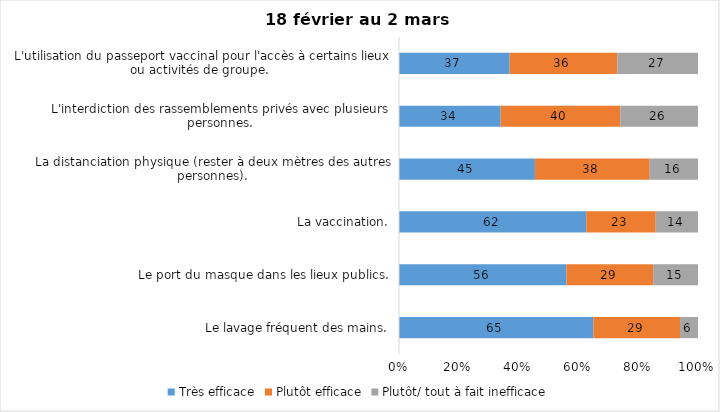
| Category | Très efficace | Plutôt efficace | Plutôt/ tout à fait inefficace |
|---|---|---|---|
| Le lavage fréquent des mains. | 65 | 29 | 6 |
| Le port du masque dans les lieux publics. | 56 | 29 | 15 |
| La vaccination. | 62 | 23 | 14 |
| La distanciation physique (rester à deux mètres des autres personnes). | 45 | 38 | 16 |
| L'interdiction des rassemblements privés avec plusieurs personnes. | 34 | 40 | 26 |
| L'utilisation du passeport vaccinal pour l'accès à certains lieux ou activités de groupe.  | 37 | 36 | 27 |